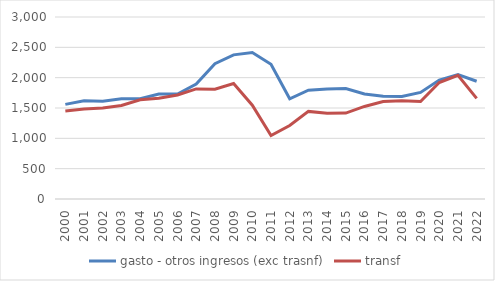
| Category | gasto - otros ingresos (exc trasnf) | transf |
|---|---|---|
| 2000.0 | 1559.284 | 1451.29 |
| 2001.0 | 1620.875 | 1483.255 |
| 2002.0 | 1611.617 | 1501.927 |
| 2003.0 | 1650.547 | 1542.263 |
| 2004.0 | 1653.441 | 1634.613 |
| 2005.0 | 1728.782 | 1659.301 |
| 2006.0 | 1729.459 | 1713.923 |
| 2007.0 | 1894.42 | 1814.765 |
| 2008.0 | 2230.686 | 1810.589 |
| 2009.0 | 2376.213 | 1902.635 |
| 2010.0 | 2414.005 | 1546.951 |
| 2011.0 | 2220.384 | 1046.819 |
| 2012.0 | 1651.374 | 1211.442 |
| 2013.0 | 1793.41 | 1443.585 |
| 2014.0 | 1815.158 | 1411.785 |
| 2015.0 | 1822.169 | 1416.159 |
| 2016.0 | 1729.87 | 1525.92 |
| 2017.0 | 1693.658 | 1605.333 |
| 2018.0 | 1688.588 | 1619.963 |
| 2019.0 | 1756.992 | 1606.974 |
| 2020.0 | 1960.449 | 1920.733 |
| 2021.0 | 2050.023 | 2037.682 |
| 2022.0 | 1941.52 | 1658.384 |